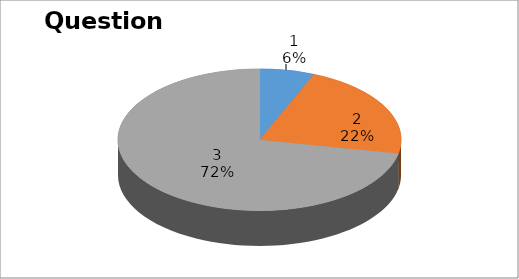
| Category | Series 0 |
|---|---|
| 0 | 2 |
| 1 | 7 |
| 2 | 23 |